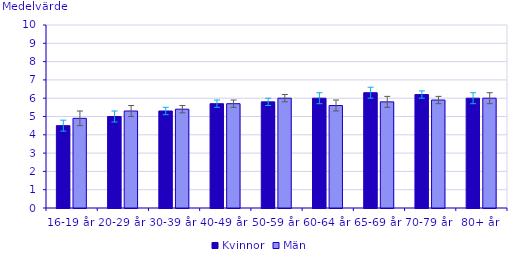
| Category | Kvinnor | Män |
|---|---|---|
| 16-19 år | 4.5 | 4.9 |
| 20-29 år | 5 | 5.3 |
| 30-39 år | 5.3 | 5.4 |
| 40-49 år | 5.7 | 5.7 |
| 50-59 år | 5.8 | 6 |
| 60-64 år | 6 | 5.6 |
| 65-69 år | 6.3 | 5.8 |
| 70-79 år | 6.2 | 5.9 |
| 80+ år | 6 | 6 |